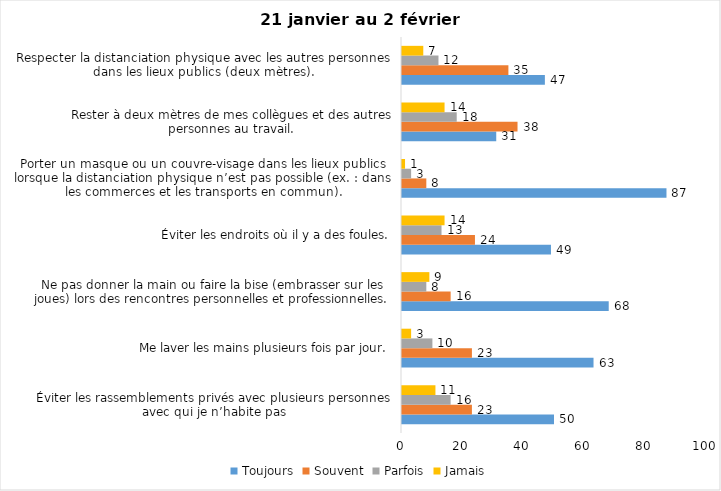
| Category | Toujours | Souvent | Parfois | Jamais |
|---|---|---|---|---|
| Éviter les rassemblements privés avec plusieurs personnes avec qui je n’habite pas | 50 | 23 | 16 | 11 |
| Me laver les mains plusieurs fois par jour. | 63 | 23 | 10 | 3 |
| Ne pas donner la main ou faire la bise (embrasser sur les joues) lors des rencontres personnelles et professionnelles. | 68 | 16 | 8 | 9 |
| Éviter les endroits où il y a des foules. | 49 | 24 | 13 | 14 |
| Porter un masque ou un couvre-visage dans les lieux publics lorsque la distanciation physique n’est pas possible (ex. : dans les commerces et les transports en commun). | 87 | 8 | 3 | 1 |
| Rester à deux mètres de mes collègues et des autres personnes au travail. | 31 | 38 | 18 | 14 |
| Respecter la distanciation physique avec les autres personnes dans les lieux publics (deux mètres). | 47 | 35 | 12 | 7 |